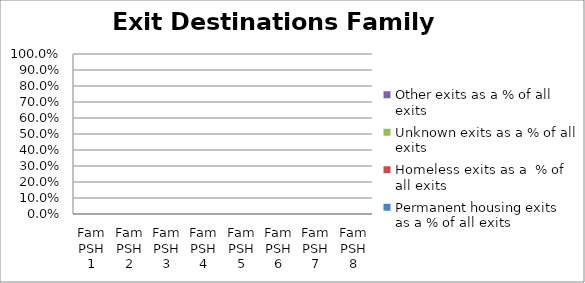
| Category | Permanent housing exits as a % of all exits | Homeless exits as a  % of all exits | Unknown exits as a % of all exits | Other exits as a % of all exits |
|---|---|---|---|---|
| Fam PSH 1 | 0 | 0 | 0 | 0 |
| Fam PSH 2 | 0 | 0 | 0 | 0 |
| Fam PSH 3 | 0 | 0 | 0 | 0 |
| Fam PSH 4 | 0 | 0 | 0 | 0 |
| Fam PSH 5 | 0 | 0 | 0 | 0 |
| Fam PSH 6 | 0 | 0 | 0 | 0 |
| Fam PSH 7 | 0 | 0 | 0 | 0 |
| Fam PSH 8 | 0 | 0 | 0 | 0 |